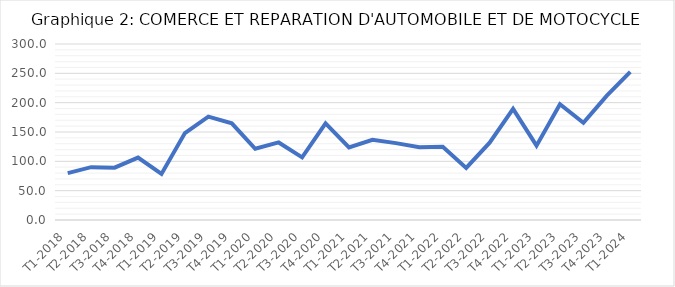
| Category | Series 0 |
|---|---|
| T1-2018 | 79.941 |
| T2-2018 | 90.09 |
| T3-2018 | 89.18 |
| T4-2018 | 106.44 |
| T1-2019 | 78.613 |
| T2-2019 | 148.268 |
| T3-2019 | 176.126 |
| T4-2019 | 164.684 |
| T1-2020 | 121.389 |
| T2-2020 | 132.202 |
| T3-2020 | 106.822 |
| T4-2020 | 164.602 |
| T1-2021 | 123.654 |
| T2-2021 | 136.629 |
| T3-2021 | 131.038 |
| T4-2021 | 124.124 |
| T1-2022 | 124.692 |
| T2-2022 | 88.756 |
| T3-2022 | 131.769 |
| T4-2022 | 189.466 |
| T1-2023 | 126.744 |
| T2-2023 | 197.222 |
| T3-2023 | 165.699 |
| T4-2023 | 211.836 |
| T1-2024 | 252.622 |